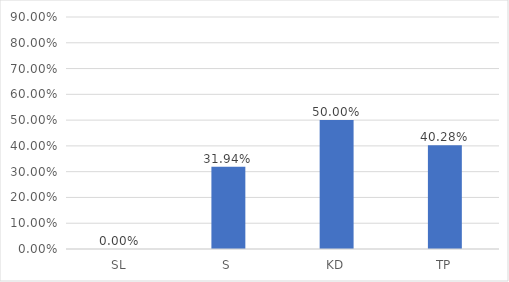
| Category | SL S KD TP |
|---|---|
| SL | 0 |
| S | 0.319 |
| KD | 0.5 |
| TP | 0.403 |